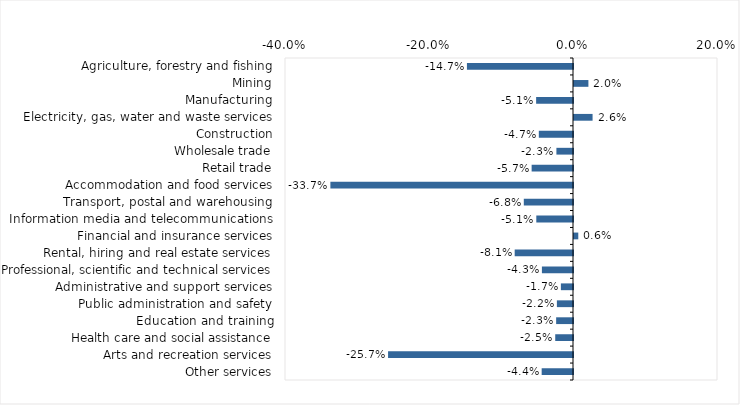
| Category | This week |
|---|---|
| Agriculture, forestry and fishing | -0.147 |
| Mining | 0.02 |
| Manufacturing | -0.051 |
| Electricity, gas, water and waste services | 0.026 |
| Construction | -0.047 |
| Wholesale trade | -0.023 |
| Retail trade | -0.057 |
| Accommodation and food services | -0.337 |
| Transport, postal and warehousing | -0.068 |
| Information media and telecommunications | -0.051 |
| Financial and insurance services | 0.006 |
| Rental, hiring and real estate services | -0.081 |
| Professional, scientific and technical services | -0.043 |
| Administrative and support services | -0.017 |
| Public administration and safety | -0.022 |
| Education and training | -0.023 |
| Health care and social assistance | -0.025 |
| Arts and recreation services | -0.257 |
| Other services | -0.044 |